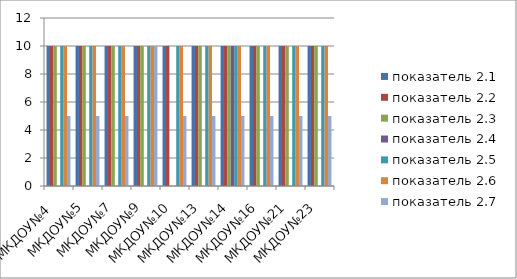
| Category | показатель 2.1 | показатель 2.2 | показатель 2.3 | показатель 2.4 | показатель 2.5 | показатель 2.6 | показатель 2.7 |
|---|---|---|---|---|---|---|---|
| МКДОУ№4  | 10 | 10 | 10 | 0 | 10 | 10 | 5 |
| МКДОУ№5 | 10 | 10 | 10 | 0 | 10 | 10 | 5 |
| МКДОУ№7 | 10 | 10 | 10 | 0 | 10 | 10 | 5 |
| МКДОУ№9 | 10 | 10 | 10 | 0 | 10 | 10 | 10 |
| МКДОУ№10 | 10 | 10 | 0 | 0 | 10 | 10 | 5 |
| МКДОУ№13 | 10 | 10 | 10 | 0 | 10 | 10 | 5 |
| МКДОУ№14 | 10 | 10 | 10 | 10 | 10 | 10 | 5 |
| МКДОУ№16 | 10 | 10 | 10 | 0 | 10 | 10 | 5 |
| МКДОУ№21 | 10 | 10 | 10 | 0 | 10 | 10 | 5 |
| МКДОУ№23 | 10 | 10 | 10 | 0 | 10 | 10 | 5 |